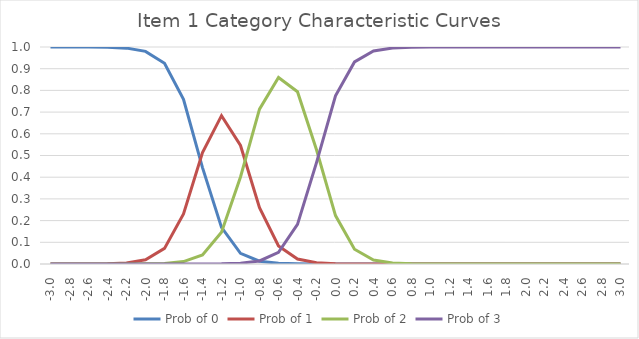
| Category | Prob of 0 | Prob of 1 | Prob of 2 | Prob of 3 |
|---|---|---|---|---|
| -3.0 | 1 | 0 | 0 | 0 |
| -2.8 | 1 | 0 | 0 | 0 |
| -2.6 | 1 | 0 | 0 | 0 |
| -2.4 | 0.999 | 0.001 | 0 | 0 |
| -2.2 | 0.995 | 0.005 | 0 | 0 |
| -2.0 | 0.98 | 0.019 | 0.001 | 0 |
| -1.8 | 0.925 | 0.072 | 0.003 | 0 |
| -1.6 | 0.759 | 0.23 | 0.011 | 0 |
| -1.4 | 0.444 | 0.514 | 0.042 | 0 |
| -1.2 | 0.169 | 0.684 | 0.147 | 0.001 |
| -1.0 | 0.049 | 0.546 | 0.401 | 0.004 |
| -0.8 | 0.013 | 0.259 | 0.714 | 0.014 |
| -0.6 | 0.003 | 0.084 | 0.859 | 0.054 |
| -0.4 | 0.001 | 0.023 | 0.794 | 0.182 |
| -0.2 | 0 | 0.006 | 0.527 | 0.467 |
| 0.0 | 0 | 0.002 | 0.223 | 0.775 |
| 0.2 | 0 | 0 | 0.068 | 0.931 |
| 0.4 | 0 | 0 | 0.018 | 0.982 |
| 0.6 | 0 | 0 | 0.005 | 0.995 |
| 0.8 | 0 | 0 | 0.001 | 0.999 |
| 1.0 | 0 | 0 | 0 | 1 |
| 1.2 | 0 | 0 | 0 | 1 |
| 1.4 | 0 | 0 | 0 | 1 |
| 1.6 | 0 | 0 | 0 | 1 |
| 1.8 | 0 | 0 | 0 | 1 |
| 2.0 | 0 | 0 | 0 | 1 |
| 2.2 | 0 | 0 | 0 | 1 |
| 2.4 | 0 | 0 | 0 | 1 |
| 2.6 | 0 | 0 | 0 | 1 |
| 2.8 | 0 | 0 | 0 | 1 |
| 3.0 | 0 | 0 | 0 | 1 |